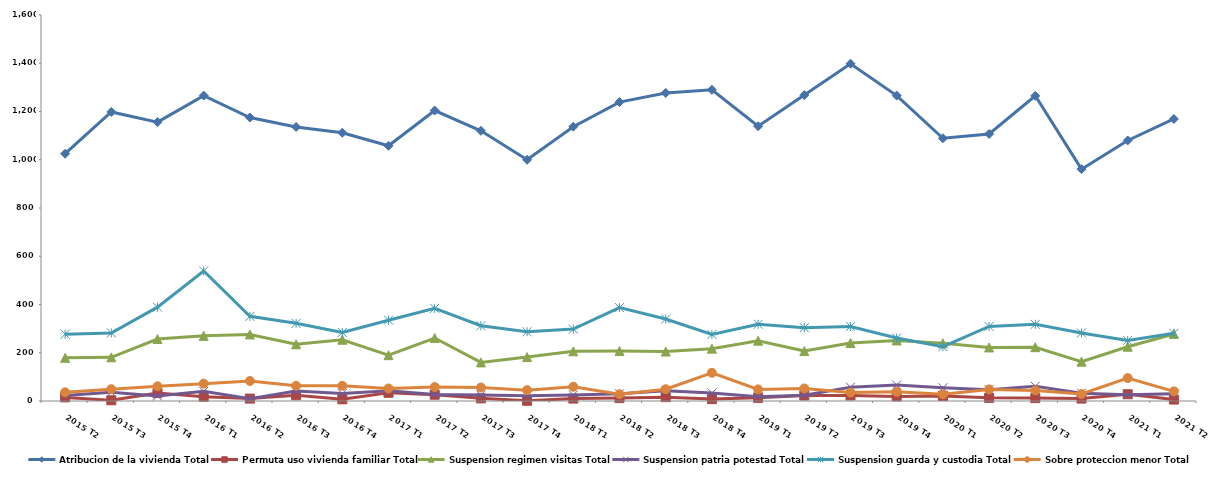
| Category | Atribucion de la vivienda Total | Permuta uso vivienda familiar Total | Suspension regimen visitas Total | Suspension patria potestad Total | Suspension guarda y custodia Total | Sobre proteccion menor Total |
|---|---|---|---|---|---|---|
| 2015 T2 | 1025 | 15 | 179 | 23 | 277 | 36 |
| 2015 T3 | 1198 | 3 | 181 | 36 | 282 | 49 |
| 2015 T4 | 1156 | 33 | 257 | 21 | 389 | 61 |
| 2016 T1 | 1266 | 18 | 270 | 40 | 539 | 72 |
| 2016 T2 | 1175 | 10 | 276 | 9 | 351 | 83 |
| 2016 T3 | 1136 | 24 | 235 | 41 | 322 | 63 |
| 2016 T4 | 1112 | 7 | 254 | 31 | 284 | 63 |
| 2017 T1 | 1058 | 34 | 190 | 42 | 335 | 52 |
| 2017 T2 | 1204 | 26 | 261 | 27 | 384 | 58 |
| 2017 T3 | 1120 | 11 | 160 | 25 | 312 | 56 |
| 2017 T4 | 1000 | 1 | 182 | 22 | 287 | 45 |
| 2018 T1 | 1137 | 10 | 206 | 25 | 298 | 59 |
| 2018 T2 | 1239 | 12 | 207 | 30 | 387 | 28 |
| 2018 T3 | 1277 | 16 | 205 | 42 | 340 | 49 |
| 2018 T4 | 1290 | 8 | 217 | 33 | 276 | 117 |
| 2019 T1 | 1139 | 13 | 250 | 18 | 318 | 48 |
| 2019 T2 | 1268 | 23 | 207 | 24 | 304 | 52 |
| 2019 T3 | 1398 | 23 | 240 | 57 | 309 | 35 |
| 2019 T4 | 1266 | 19 | 251 | 66 | 261 | 38 |
| 2020 T1 | 1089 | 21 | 239 | 55 | 225 | 28 |
| 2020 T2 | 1107 | 13 | 222 | 47 | 309 | 48 |
| 2020 T3 | 1265 | 12 | 223 | 61 | 318 | 44 |
| 2020 T4 | 961 | 10 | 163 | 32 | 282 | 29 |
| 2021 T1 | 1080 | 28 | 225 | 26 | 251 | 95 |
| 2021 T2 | 1169 | 6 | 278 | 30 | 281 | 40 |